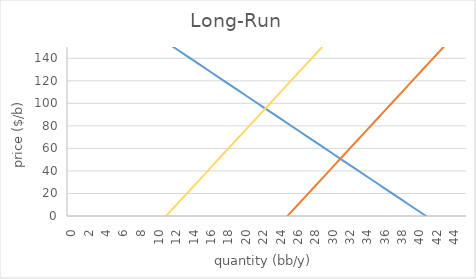
| Category | Series 0 | Series 1 | Series 2 |
|---|---|---|---|
| 0.0 | 210 | -206.667 | -90 |
| 1.0 | 204.849 | -198.333 | -81.667 |
| 2.0 | 199.698 | -190 | -73.333 |
| 3.0 | 194.547 | -181.667 | -65 |
| 4.0 | 189.396 | -173.333 | -56.667 |
| 5.0 | 184.245 | -165 | -48.333 |
| 6.0 | 179.093 | -156.667 | -40 |
| 7.0 | 173.942 | -148.333 | -31.667 |
| 8.0 | 168.791 | -140 | -23.333 |
| 9.0 | 163.64 | -131.667 | -15 |
| 10.0 | 158.489 | -123.333 | -6.667 |
| 11.0 | 153.338 | -115 | 1.667 |
| 12.0 | 148.187 | -106.667 | 10 |
| 13.0 | 143.036 | -98.333 | 18.333 |
| 14.0 | 137.885 | -90 | 26.667 |
| 15.0 | 132.734 | -81.667 | 35 |
| 16.0 | 127.582 | -73.333 | 43.333 |
| 17.0 | 122.431 | -65 | 51.667 |
| 18.0 | 117.28 | -56.667 | 60 |
| 19.0 | 112.129 | -48.333 | 68.333 |
| 20.0 | 106.978 | -40 | 76.667 |
| 21.0 | 101.827 | -31.667 | 85 |
| 22.0 | 96.676 | -23.333 | 93.333 |
| 23.0 | 91.525 | -15 | 101.667 |
| 24.0 | 86.374 | -6.667 | 110 |
| 25.0 | 81.223 | 1.667 | 118.333 |
| 26.0 | 76.071 | 10 | 126.667 |
| 27.0 | 70.92 | 18.333 | 135 |
| 28.0 | 65.769 | 26.667 | 143.333 |
| 29.0 | 60.618 | 35 | 151.667 |
| 30.0 | 55.467 | 43.333 | 160 |
| 31.0 | 50.316 | 51.667 | 168.333 |
| 32.0 | 45.165 | 60 | 176.667 |
| 33.0 | 40.014 | 68.333 | 185 |
| 34.0 | 34.863 | 76.667 | 193.333 |
| 35.0 | 29.712 | 85 | 201.667 |
| 36.0 | 24.56 | 93.333 | 210 |
| 37.0 | 19.409 | 101.667 | 218.333 |
| 38.0 | 14.258 | 110 | 226.667 |
| 39.0 | 9.107 | 118.333 | 235 |
| 40.0 | 3.956 | 126.667 | 243.333 |
| 41.0 | -1.195 | 135 | 251.667 |
| 42.0 | -6.346 | 143.333 | 260 |
| 43.0 | -11.497 | 151.667 | 268.333 |
| 44.0 | -16.648 | 160 | 276.667 |
| 45.0 | -21.799 | 168.333 | 285 |